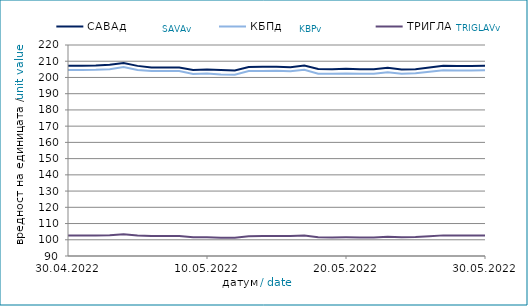
| Category | САВАд | КБПд | ТРИГЛАВд |
|---|---|---|---|
| 2022-04-30 | 207.215 | 204.583 | 102.595 |
| 2022-05-01 | 207.22 | 204.59 | 102.597 |
| 2022-05-02 | 207.316 | 204.737 | 102.659 |
| 2022-05-03 | 207.871 | 205.076 | 102.788 |
| 2022-05-04 | 208.902 | 206.379 | 103.428 |
| 2022-05-05 | 207.135 | 204.558 | 102.635 |
| 2022-05-06 | 206.112 | 203.916 | 102.351 |
| 2022-05-07 | 206.142 | 203.964 | 102.363 |
| 2022-05-08 | 206.148 | 203.971 | 102.366 |
| 2022-05-09 | 204.549 | 202.187 | 101.51 |
| 2022-05-10 | 204.935 | 202.481 | 101.524 |
| 2022-05-11 | 204.577 | 201.832 | 101.267 |
| 2022-05-12 | 204.337 | 201.743 | 101.28 |
| 2022-05-13 | 206.462 | 203.926 | 102.206 |
| 2022-05-14 | 206.567 | 204.055 | 102.265 |
| 2022-05-15 | 206.574 | 204.062 | 102.267 |
| 2022-05-16 | 206.315 | 203.853 | 102.291 |
| 2022-05-17 | 207.323 | 204.793 | 102.702 |
| 2022-05-18 | 205.193 | 202.275 | 101.558 |
| 2022-05-19 | 205.087 | 202.352 | 101.455 |
| 2022-05-20 | 205.299 | 202.505 | 101.481 |
| 2022-05-21 | 205.085 | 202.238 | 101.363 |
| 2022-05-22 | 205.092 | 202.245 | 101.366 |
| 2022-05-23 | 205.983 | 203.197 | 101.863 |
| 2022-05-24 | 204.977 | 202.321 | 101.517 |
| 2022-05-25 | 205.063 | 202.586 | 101.725 |
| 2022-05-26 | 206.121 | 203.508 | 102.209 |
| 2022-05-27 | 207.172 | 204.451 | 102.707 |
| 2022-05-28 | 207.077 | 204.324 | 102.645 |
| 2022-05-29 | 207.083 | 204.33 | 102.647 |
| 2022-05-30 | 207.162 | 204.384 | 102.699 |